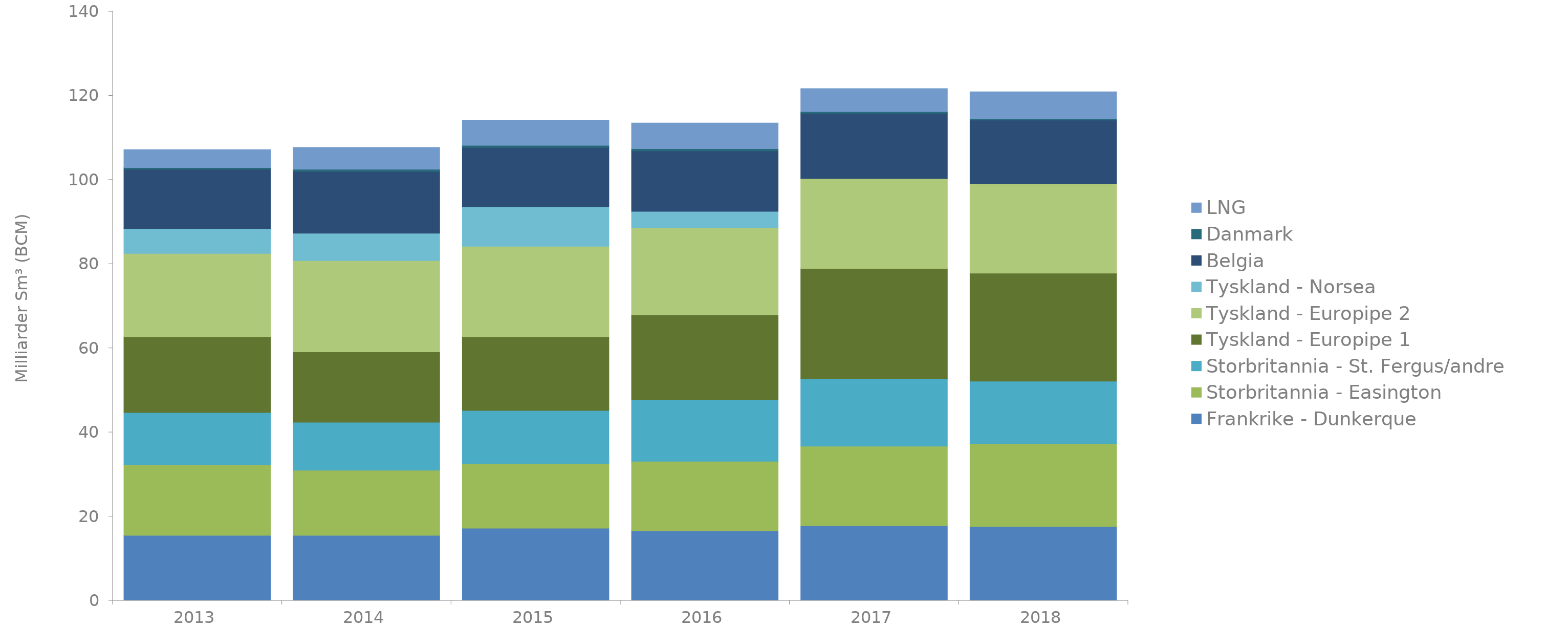
| Category | Frankrike - Dunkerque | Storbritannia - Easington | Storbritannia - St. Fergus/andre | Tyskland - Europipe 1 | Tyskland - Europipe 2 | Tyskland - Norsea | Belgia | Danmark | LNG |
|---|---|---|---|---|---|---|---|---|---|
| 2013.0 | 15.5 | 16.8 | 12.4 | 18 | 19.8 | 5.9 | 14.1 | 0.4 | 4.3 |
| 2014.0 | 15.5 | 15.5 | 11.4 | 16.7 | 21.7 | 6.5 | 14.7 | 0.5 | 5.2 |
| 2015.0 | 17.2 | 15.4 | 12.6 | 17.5 | 21.5 | 9.4 | 14.1 | 0.5 | 6 |
| 2016.0 | 16.6 | 16.5 | 14.6 | 20.2 | 20.7 | 3.9 | 14.4 | 0.5 | 6.1 |
| 2017.0 | 17.8 | 18.9 | 16.1 | 26.1 | 21.4 | 0 | 15.5 | 0.4 | 5.5 |
| 2018.0 | 17.61 | 19.73 | 14.82 | 25.67 | 21.21 | 0 | 15.15 | 0.3 | 6.45 |